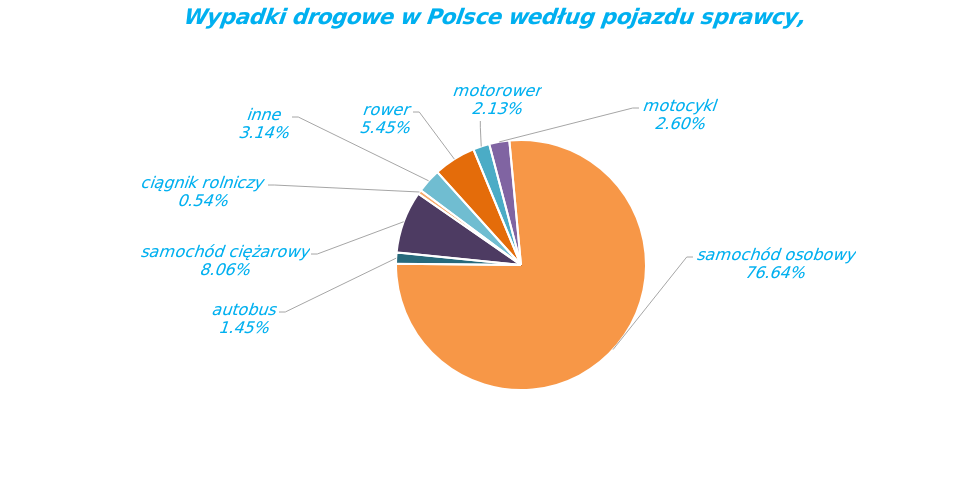
| Category | Series 0 |
|---|---|
| rower | 1546 |
| motorower | 603 |
| motocykl | 738 |
| samochód osobowy | 21733 |
| autobus | 411 |
| samochód ciężarowy | 2285 |
| ciągnik rolniczy | 152 |
| inne | 891 |